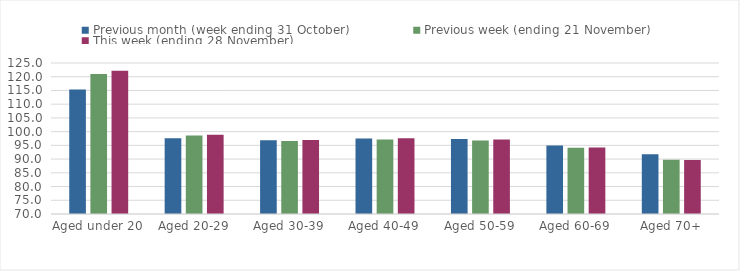
| Category | Previous month (week ending 31 October) | Previous week (ending 21 November) | This week (ending 28 November) |
|---|---|---|---|
| Aged under 20 | 115.37 | 120.99 | 122.15 |
| Aged 20-29 | 97.61 | 98.55 | 98.91 |
| Aged 30-39 | 96.84 | 96.63 | 96.97 |
| Aged 40-49 | 97.48 | 97.14 | 97.58 |
| Aged 50-59 | 97.33 | 96.78 | 97.17 |
| Aged 60-69 | 94.94 | 94.14 | 94.2 |
| Aged 70+ | 91.78 | 89.74 | 89.69 |